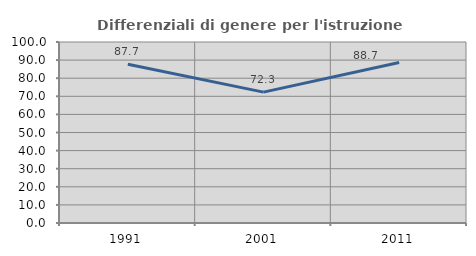
| Category | Differenziali di genere per l'istruzione superiore |
|---|---|
| 1991.0 | 87.711 |
| 2001.0 | 72.292 |
| 2011.0 | 88.699 |